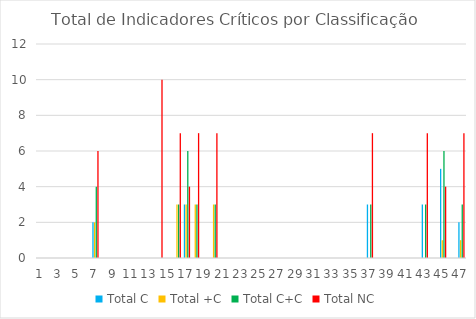
| Category | Total C | Total +C | Total C+C | Total NC |
|---|---|---|---|---|
| 0 | 0 | 0 | 0 | 0 |
| 1 | 0 | 0 | 0 | 0 |
| 2 | 0 | 0 | 0 | 0 |
| 3 | 0 | 0 | 0 | 0 |
| 4 | 0 | 0 | 0 | 0 |
| 5 | 0 | 0 | 0 | 0 |
| 6 | 2 | 2 | 4 | 6 |
| 7 | 0 | 0 | 0 | 0 |
| 8 | 0 | 0 | 0 | 0 |
| 9 | 0 | 0 | 0 | 0 |
| 10 | 0 | 0 | 0 | 0 |
| 11 | 0 | 0 | 0 | 0 |
| 12 | 0 | 0 | 0 | 0 |
| 13 | 0 | 0 | 0 | 10 |
| 14 | 0 | 0 | 0 | 0 |
| 15 | 0 | 3 | 3 | 7 |
| 16 | 3 | 3 | 6 | 4 |
| 17 | 0 | 3 | 3 | 7 |
| 18 | 0 | 0 | 0 | 0 |
| 19 | 0 | 3 | 3 | 7 |
| 20 | 0 | 0 | 0 | 0 |
| 21 | 0 | 0 | 0 | 0 |
| 22 | 0 | 0 | 0 | 0 |
| 23 | 0 | 0 | 0 | 0 |
| 24 | 0 | 0 | 0 | 0 |
| 25 | 0 | 0 | 0 | 0 |
| 26 | 0 | 0 | 0 | 0 |
| 27 | 0 | 0 | 0 | 0 |
| 28 | 0 | 0 | 0 | 0 |
| 29 | 0 | 0 | 0 | 0 |
| 30 | 0 | 0 | 0 | 0 |
| 31 | 0 | 0 | 0 | 0 |
| 32 | 0 | 0 | 0 | 0 |
| 33 | 0 | 0 | 0 | 0 |
| 34 | 0 | 0 | 0 | 0 |
| 35 | 0 | 0 | 0 | 0 |
| 36 | 3 | 0 | 3 | 7 |
| 37 | 0 | 0 | 0 | 0 |
| 38 | 0 | 0 | 0 | 0 |
| 39 | 0 | 0 | 0 | 0 |
| 40 | 0 | 0 | 0 | 0 |
| 41 | 0 | 0 | 0 | 0 |
| 42 | 3 | 0 | 3 | 7 |
| 43 | 0 | 0 | 0 | 0 |
| 44 | 5 | 1 | 6 | 4 |
| 45 | 0 | 0 | 0 | 0 |
| 46 | 2 | 1 | 3 | 7 |